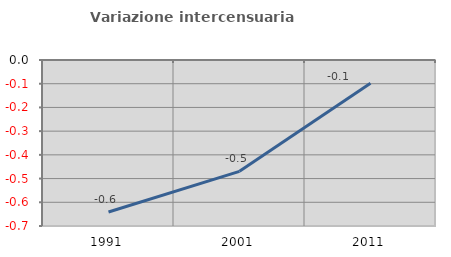
| Category | Variazione intercensuaria annua |
|---|---|
| 1991.0 | -0.641 |
| 2001.0 | -0.47 |
| 2011.0 | -0.098 |